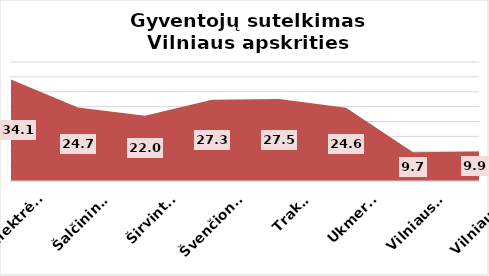
| Category | Series 0 |
|---|---|
| Elektrėnai | 34.134 |
| Šalčininkai | 24.728 |
| Širvintos | 21.956 |
| Švenčionys | 27.278 |
| Trakai | 27.531 |
| Ukmergė | 24.622 |
| Vilniaus r. | 9.673 |
| Vilniaus m. | 9.943 |